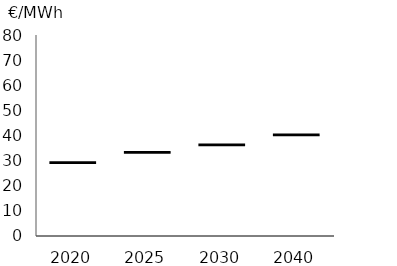
| Category | Series 1 | Series 2 | Series 3 | Series 4 |
|---|---|---|---|---|
| 2020.0 | 0 | 29 | 0.1 | -29.1 |
| 2025.0 | 0 | 33 | 0.1 | -33.1 |
| 2030.0 | 0 | 36 | 0.1 | -36.1 |
| 2040.0 | 0 | 40 | 0.1 | -40.1 |